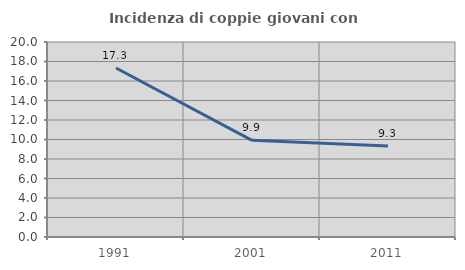
| Category | Incidenza di coppie giovani con figli |
|---|---|
| 1991.0 | 17.332 |
| 2001.0 | 9.911 |
| 2011.0 | 9.338 |